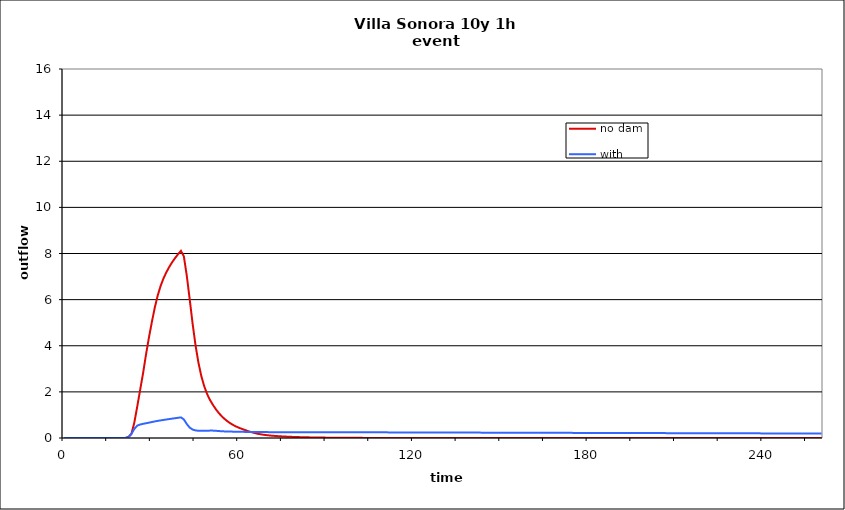
| Category | no dam | with dam |
|---|---|---|
| 0.0 | 0 | 0 |
| 1.0 | 0 | 0 |
| 2.0 | 0 | 0 |
| 3.0 | 0 | 0 |
| 4.0 | 0 | 0 |
| 5.0 | 0 | 0 |
| 6.0 | 0 | 0 |
| 7.0 | 0 | 0 |
| 8.0 | 0 | 0 |
| 9.0 | 0 | 0 |
| 10.0 | 0 | 0 |
| 11.0 | 0 | 0 |
| 12.0 | 0 | 0 |
| 13.0 | 0 | 0 |
| 14.0 | 0 | 0 |
| 15.0 | 0 | 0 |
| 16.0 | 0 | 0 |
| 17.0 | 0 | 0 |
| 18.0 | 0 | 0 |
| 19.0 | 0 | 0 |
| 20.0 | 0 | 0 |
| 21.0 | 0.004 | 0.004 |
| 22.0 | 0.046 | 0.046 |
| 23.0 | 0.178 | 0.179 |
| 24.0 | 0.673 | 0.395 |
| 25.0 | 1.366 | 0.536 |
| 26.0 | 2.09 | 0.585 |
| 27.0 | 2.811 | 0.614 |
| 28.0 | 3.613 | 0.64 |
| 29.0 | 4.35 | 0.665 |
| 30.0 | 5.018 | 0.691 |
| 31.0 | 5.643 | 0.719 |
| 32.0 | 6.168 | 0.742 |
| 33.0 | 6.584 | 0.763 |
| 34.0 | 6.917 | 0.783 |
| 35.0 | 7.188 | 0.802 |
| 36.0 | 7.42 | 0.822 |
| 37.0 | 7.624 | 0.84 |
| 38.0 | 7.803 | 0.859 |
| 39.0 | 7.968 | 0.877 |
| 40.0 | 8.116 | 0.894 |
| 41.0 | 7.879 | 0.806 |
| 42.0 | 7.045 | 0.609 |
| 43.0 | 6.031 | 0.452 |
| 44.0 | 4.967 | 0.368 |
| 45.0 | 4.03 | 0.329 |
| 46.0 | 3.272 | 0.314 |
| 47.0 | 2.687 | 0.311 |
| 48.0 | 2.243 | 0.313 |
| 49.0 | 1.903 | 0.317 |
| 50.0 | 1.644 | 0.32 |
| 51.0 | 1.433 | 0.32 |
| 52.0 | 1.246 | 0.312 |
| 53.0 | 1.083 | 0.301 |
| 54.0 | 0.945 | 0.292 |
| 55.0 | 0.826 | 0.286 |
| 56.0 | 0.723 | 0.281 |
| 57.0 | 0.635 | 0.278 |
| 58.0 | 0.559 | 0.276 |
| 59.0 | 0.495 | 0.274 |
| 60.0 | 0.441 | 0.274 |
| 61.0 | 0.392 | 0.271 |
| 62.0 | 0.346 | 0.264 |
| 63.0 | 0.302 | 0.258 |
| 64.0 | 0.261 | 0.255 |
| 65.0 | 0.225 | 0.255 |
| 66.0 | 0.195 | 0.255 |
| 67.0 | 0.169 | 0.255 |
| 68.0 | 0.148 | 0.255 |
| 69.0 | 0.131 | 0.255 |
| 70.0 | 0.116 | 0.255 |
| 71.0 | 0.103 | 0.255 |
| 72.0 | 0.092 | 0.254 |
| 73.0 | 0.083 | 0.254 |
| 74.0 | 0.075 | 0.254 |
| 75.0 | 0.067 | 0.254 |
| 76.0 | 0.061 | 0.254 |
| 77.0 | 0.055 | 0.254 |
| 78.0 | 0.05 | 0.253 |
| 79.0 | 0.045 | 0.253 |
| 80.0 | 0.04 | 0.253 |
| 81.0 | 0.037 | 0.253 |
| 82.0 | 0.033 | 0.252 |
| 83.0 | 0.03 | 0.252 |
| 84.0 | 0.027 | 0.252 |
| 85.0 | 0.025 | 0.252 |
| 86.0 | 0.023 | 0.251 |
| 87.0 | 0.021 | 0.251 |
| 88.0 | 0.019 | 0.251 |
| 89.0 | 0.017 | 0.251 |
| 90.0 | 0.016 | 0.25 |
| 91.0 | 0.014 | 0.25 |
| 92.0 | 0.013 | 0.25 |
| 93.0 | 0.012 | 0.249 |
| 94.0 | 0.011 | 0.249 |
| 95.0 | 0.01 | 0.249 |
| 96.0 | 0.009 | 0.249 |
| 97.0 | 0.009 | 0.248 |
| 98.0 | 0.008 | 0.248 |
| 99.0 | 0.007 | 0.248 |
| 100.0 | 0.007 | 0.247 |
| 101.0 | 0.006 | 0.247 |
| 102.0 | 0.005 | 0.247 |
| 103.0 | 0.005 | 0.246 |
| 104.0 | 0.004 | 0.246 |
| 105.0 | 0.004 | 0.246 |
| 106.0 | 0.004 | 0.245 |
| 107.0 | 0.003 | 0.245 |
| 108.0 | 0.003 | 0.245 |
| 109.0 | 0.002 | 0.244 |
| 110.0 | 0.002 | 0.244 |
| 111.0 | 0.002 | 0.244 |
| 112.0 | 0.002 | 0.243 |
| 113.0 | 0.001 | 0.243 |
| 114.0 | 0.001 | 0.243 |
| 115.0 | 0.001 | 0.242 |
| 116.0 | 0.001 | 0.242 |
| 117.0 | 0.001 | 0.242 |
| 118.0 | 0.001 | 0.241 |
| 119.0 | 0.001 | 0.241 |
| 120.0 | 0.001 | 0.241 |
| 121.0 | 0.001 | 0.24 |
| 122.0 | 0 | 0.24 |
| 123.0 | 0 | 0.24 |
| 124.0 | 0 | 0.239 |
| 125.0 | 0 | 0.239 |
| 126.0 | 0 | 0.239 |
| 127.0 | 0 | 0.238 |
| 128.0 | 0 | 0.238 |
| 129.0 | 0 | 0.238 |
| 130.0 | 0 | 0.237 |
| 131.0 | 0 | 0.237 |
| 132.0 | 0 | 0.237 |
| 133.0 | 0 | 0.236 |
| 134.0 | 0 | 0.236 |
| 135.0 | 0 | 0.236 |
| 136.0 | 0 | 0.235 |
| 137.0 | 0 | 0.235 |
| 138.0 | 0 | 0.235 |
| 139.0 | 0 | 0.234 |
| 140.0 | 0 | 0.234 |
| 141.0 | 0 | 0.234 |
| 142.0 | 0 | 0.233 |
| 143.0 | 0 | 0.233 |
| 144.0 | 0 | 0.233 |
| 145.0 | 0 | 0.232 |
| 146.0 | 0 | 0.232 |
| 147.0 | 0 | 0.232 |
| 148.0 | 0 | 0.231 |
| 149.0 | 0 | 0.231 |
| 150.0 | 0 | 0.231 |
| 151.0 | 0 | 0.23 |
| 152.0 | 0 | 0.23 |
| 153.0 | 0 | 0.23 |
| 154.0 | 0 | 0.229 |
| 155.0 | 0 | 0.229 |
| 156.0 | 0 | 0.229 |
| 157.0 | 0 | 0.228 |
| 158.0 | 0 | 0.228 |
| 159.0 | 0 | 0.228 |
| 160.0 | 0 | 0.227 |
| 161.0 | 0 | 0.227 |
| 162.0 | 0 | 0.226 |
| 163.0 | 0 | 0.226 |
| 164.0 | 0 | 0.226 |
| 165.0 | 0 | 0.225 |
| 166.0 | 0 | 0.225 |
| 167.0 | 0 | 0.225 |
| 168.0 | 0 | 0.224 |
| 169.0 | 0 | 0.224 |
| 170.0 | 0 | 0.224 |
| 171.0 | 0 | 0.223 |
| 172.0 | 0 | 0.223 |
| 173.0 | 0 | 0.223 |
| 174.0 | 0 | 0.222 |
| 175.0 | 0 | 0.222 |
| 176.0 | 0 | 0.222 |
| 177.0 | 0 | 0.221 |
| 178.0 | 0 | 0.221 |
| 179.0 | 0 | 0.221 |
| 180.0 | 0 | 0.22 |
| 181.0 | 0 | 0.22 |
| 182.0 | 0 | 0.22 |
| 183.0 | 0 | 0.219 |
| 184.0 | 0 | 0.219 |
| 185.0 | 0 | 0.219 |
| 186.0 | 0 | 0.218 |
| 187.0 | 0 | 0.218 |
| 188.0 | 0 | 0.218 |
| 189.0 | 0 | 0.217 |
| 190.0 | 0 | 0.217 |
| 191.0 | 0 | 0.217 |
| 192.0 | 0 | 0.216 |
| 193.0 | 0 | 0.216 |
| 194.0 | 0 | 0.216 |
| 195.0 | 0 | 0.215 |
| 196.0 | 0 | 0.215 |
| 197.0 | 0 | 0.215 |
| 198.0 | 0 | 0.214 |
| 199.0 | 0 | 0.214 |
| 200.0 | 0 | 0.214 |
| 201.0 | 0 | 0.213 |
| 202.0 | 0 | 0.213 |
| 203.0 | 0 | 0.213 |
| 204.0 | 0 | 0.212 |
| 205.0 | 0 | 0.212 |
| 206.0 | 0 | 0.212 |
| 207.0 | 0 | 0.211 |
| 208.0 | 0 | 0.211 |
| 209.0 | 0 | 0.21 |
| 210.0 | 0 | 0.21 |
| 211.0 | 0 | 0.21 |
| 212.0 | 0 | 0.209 |
| 213.0 | 0 | 0.209 |
| 214.0 | 0 | 0.209 |
| 215.0 | 0 | 0.208 |
| 216.0 | 0 | 0.208 |
| 217.0 | 0 | 0.208 |
| 218.0 | 0 | 0.207 |
| 219.0 | 0 | 0.207 |
| 220.0 | 0 | 0.207 |
| 221.0 | 0 | 0.206 |
| 222.0 | 0 | 0.206 |
| 223.0 | 0 | 0.206 |
| 224.0 | 0 | 0.205 |
| 225.0 | 0 | 0.205 |
| 226.0 | 0 | 0.205 |
| 227.0 | 0 | 0.204 |
| 228.0 | 0 | 0.204 |
| 229.0 | 0 | 0.204 |
| 230.0 | 0 | 0.203 |
| 231.0 | 0 | 0.203 |
| 232.0 | 0 | 0.203 |
| 233.0 | 0 | 0.202 |
| 234.0 | 0 | 0.202 |
| 235.0 | 0 | 0.202 |
| 236.0 | 0 | 0.201 |
| 237.0 | 0 | 0.201 |
| 238.0 | 0 | 0.201 |
| 239.0 | 0 | 0.2 |
| 240.0 | 0 | 0.2 |
| 241.0 | 0 | 0.2 |
| 242.0 | 0 | 0.199 |
| 243.0 | 0 | 0.199 |
| 244.0 | 0 | 0.199 |
| 245.0 | 0 | 0.198 |
| 246.0 | 0 | 0.198 |
| 247.0 | 0 | 0.198 |
| 248.0 | 0 | 0.197 |
| 249.0 | 0 | 0.197 |
| 250.0 | 0 | 0.197 |
| 251.0 | 0 | 0.196 |
| 252.0 | 0 | 0.196 |
| 253.0 | 0 | 0.196 |
| 254.0 | 0 | 0.196 |
| 255.0 | 0 | 0.195 |
| 256.0 | 0 | 0.195 |
| 257.0 | 0 | 0.195 |
| 258.0 | 0 | 0.194 |
| 259.0 | 0 | 0.194 |
| 260.0 | 0 | 0.194 |